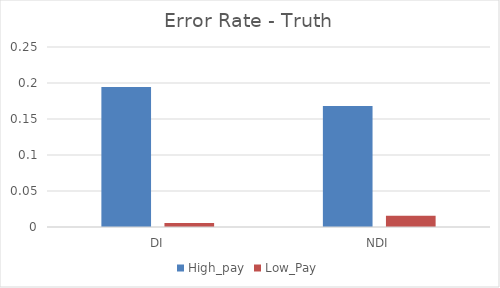
| Category | High_pay | Low_Pay |
|---|---|---|
| DI | 0.194 | 0.006 |
| NDI | 0.168 | 0.016 |